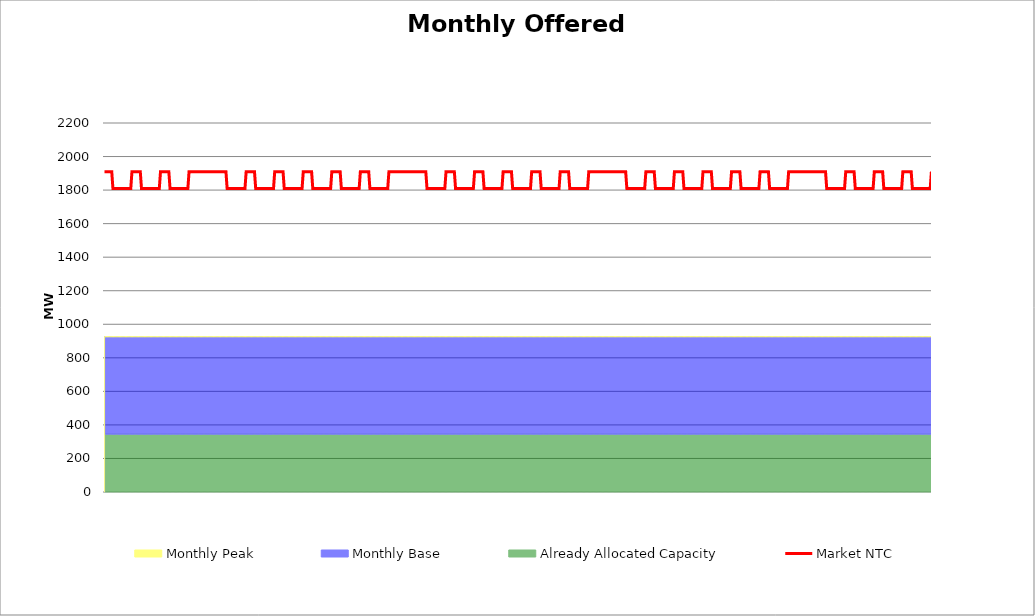
| Category | Market NTC |
|---|---|
| 0 | 1910 |
| 1 | 1910 |
| 2 | 1910 |
| 3 | 1910 |
| 4 | 1910 |
| 5 | 1910 |
| 6 | 1910 |
| 7 | 1810 |
| 8 | 1810 |
| 9 | 1810 |
| 10 | 1810 |
| 11 | 1810 |
| 12 | 1810 |
| 13 | 1810 |
| 14 | 1810 |
| 15 | 1810 |
| 16 | 1810 |
| 17 | 1810 |
| 18 | 1810 |
| 19 | 1810 |
| 20 | 1810 |
| 21 | 1810 |
| 22 | 1810 |
| 23 | 1910 |
| 24 | 1910 |
| 25 | 1910 |
| 26 | 1910 |
| 27 | 1910 |
| 28 | 1910 |
| 29 | 1910 |
| 30 | 1910 |
| 31 | 1810 |
| 32 | 1810 |
| 33 | 1810 |
| 34 | 1810 |
| 35 | 1810 |
| 36 | 1810 |
| 37 | 1810 |
| 38 | 1810 |
| 39 | 1810 |
| 40 | 1810 |
| 41 | 1810 |
| 42 | 1810 |
| 43 | 1810 |
| 44 | 1810 |
| 45 | 1810 |
| 46 | 1810 |
| 47 | 1910 |
| 48 | 1910 |
| 49 | 1910 |
| 50 | 1910 |
| 51 | 1910 |
| 52 | 1910 |
| 53 | 1910 |
| 54 | 1910 |
| 55 | 1810 |
| 56 | 1810 |
| 57 | 1810 |
| 58 | 1810 |
| 59 | 1810 |
| 60 | 1810 |
| 61 | 1810 |
| 62 | 1810 |
| 63 | 1810 |
| 64 | 1810 |
| 65 | 1810 |
| 66 | 1810 |
| 67 | 1810 |
| 68 | 1810 |
| 69 | 1810 |
| 70 | 1810 |
| 71 | 1910 |
| 72 | 1910 |
| 73 | 1910 |
| 74 | 1910 |
| 75 | 1910 |
| 76 | 1910 |
| 77 | 1910 |
| 78 | 1910 |
| 79 | 1910 |
| 80 | 1910 |
| 81 | 1910 |
| 82 | 1910 |
| 83 | 1910 |
| 84 | 1910 |
| 85 | 1910 |
| 86 | 1910 |
| 87 | 1910 |
| 88 | 1910 |
| 89 | 1910 |
| 90 | 1910 |
| 91 | 1910 |
| 92 | 1910 |
| 93 | 1910 |
| 94 | 1910 |
| 95 | 1910 |
| 96 | 1910 |
| 97 | 1910 |
| 98 | 1910 |
| 99 | 1910 |
| 100 | 1910 |
| 101 | 1910 |
| 102 | 1910 |
| 103 | 1810 |
| 104 | 1810 |
| 105 | 1810 |
| 106 | 1810 |
| 107 | 1810 |
| 108 | 1810 |
| 109 | 1810 |
| 110 | 1810 |
| 111 | 1810 |
| 112 | 1810 |
| 113 | 1810 |
| 114 | 1810 |
| 115 | 1810 |
| 116 | 1810 |
| 117 | 1810 |
| 118 | 1810 |
| 119 | 1910 |
| 120 | 1910 |
| 121 | 1910 |
| 122 | 1910 |
| 123 | 1910 |
| 124 | 1910 |
| 125 | 1910 |
| 126 | 1910 |
| 127 | 1810 |
| 128 | 1810 |
| 129 | 1810 |
| 130 | 1810 |
| 131 | 1810 |
| 132 | 1810 |
| 133 | 1810 |
| 134 | 1810 |
| 135 | 1810 |
| 136 | 1810 |
| 137 | 1810 |
| 138 | 1810 |
| 139 | 1810 |
| 140 | 1810 |
| 141 | 1810 |
| 142 | 1810 |
| 143 | 1910 |
| 144 | 1910 |
| 145 | 1910 |
| 146 | 1910 |
| 147 | 1910 |
| 148 | 1910 |
| 149 | 1910 |
| 150 | 1910 |
| 151 | 1810 |
| 152 | 1810 |
| 153 | 1810 |
| 154 | 1810 |
| 155 | 1810 |
| 156 | 1810 |
| 157 | 1810 |
| 158 | 1810 |
| 159 | 1810 |
| 160 | 1810 |
| 161 | 1810 |
| 162 | 1810 |
| 163 | 1810 |
| 164 | 1810 |
| 165 | 1810 |
| 166 | 1810 |
| 167 | 1910 |
| 168 | 1910 |
| 169 | 1910 |
| 170 | 1910 |
| 171 | 1910 |
| 172 | 1910 |
| 173 | 1910 |
| 174 | 1910 |
| 175 | 1810 |
| 176 | 1810 |
| 177 | 1810 |
| 178 | 1810 |
| 179 | 1810 |
| 180 | 1810 |
| 181 | 1810 |
| 182 | 1810 |
| 183 | 1810 |
| 184 | 1810 |
| 185 | 1810 |
| 186 | 1810 |
| 187 | 1810 |
| 188 | 1810 |
| 189 | 1810 |
| 190 | 1810 |
| 191 | 1910 |
| 192 | 1910 |
| 193 | 1910 |
| 194 | 1910 |
| 195 | 1910 |
| 196 | 1910 |
| 197 | 1910 |
| 198 | 1910 |
| 199 | 1810 |
| 200 | 1810 |
| 201 | 1810 |
| 202 | 1810 |
| 203 | 1810 |
| 204 | 1810 |
| 205 | 1810 |
| 206 | 1810 |
| 207 | 1810 |
| 208 | 1810 |
| 209 | 1810 |
| 210 | 1810 |
| 211 | 1810 |
| 212 | 1810 |
| 213 | 1810 |
| 214 | 1810 |
| 215 | 1910 |
| 216 | 1910 |
| 217 | 1910 |
| 218 | 1910 |
| 219 | 1910 |
| 220 | 1910 |
| 221 | 1910 |
| 222 | 1910 |
| 223 | 1810 |
| 224 | 1810 |
| 225 | 1810 |
| 226 | 1810 |
| 227 | 1810 |
| 228 | 1810 |
| 229 | 1810 |
| 230 | 1810 |
| 231 | 1810 |
| 232 | 1810 |
| 233 | 1810 |
| 234 | 1810 |
| 235 | 1810 |
| 236 | 1810 |
| 237 | 1810 |
| 238 | 1810 |
| 239 | 1910 |
| 240 | 1910 |
| 241 | 1910 |
| 242 | 1910 |
| 243 | 1910 |
| 244 | 1910 |
| 245 | 1910 |
| 246 | 1910 |
| 247 | 1910 |
| 248 | 1910 |
| 249 | 1910 |
| 250 | 1910 |
| 251 | 1910 |
| 252 | 1910 |
| 253 | 1910 |
| 254 | 1910 |
| 255 | 1910 |
| 256 | 1910 |
| 257 | 1910 |
| 258 | 1910 |
| 259 | 1910 |
| 260 | 1910 |
| 261 | 1910 |
| 262 | 1910 |
| 263 | 1910 |
| 264 | 1910 |
| 265 | 1910 |
| 266 | 1910 |
| 267 | 1910 |
| 268 | 1910 |
| 269 | 1910 |
| 270 | 1910 |
| 271 | 1810 |
| 272 | 1810 |
| 273 | 1810 |
| 274 | 1810 |
| 275 | 1810 |
| 276 | 1810 |
| 277 | 1810 |
| 278 | 1810 |
| 279 | 1810 |
| 280 | 1810 |
| 281 | 1810 |
| 282 | 1810 |
| 283 | 1810 |
| 284 | 1810 |
| 285 | 1810 |
| 286 | 1810 |
| 287 | 1910 |
| 288 | 1910 |
| 289 | 1910 |
| 290 | 1910 |
| 291 | 1910 |
| 292 | 1910 |
| 293 | 1910 |
| 294 | 1910 |
| 295 | 1810 |
| 296 | 1810 |
| 297 | 1810 |
| 298 | 1810 |
| 299 | 1810 |
| 300 | 1810 |
| 301 | 1810 |
| 302 | 1810 |
| 303 | 1810 |
| 304 | 1810 |
| 305 | 1810 |
| 306 | 1810 |
| 307 | 1810 |
| 308 | 1810 |
| 309 | 1810 |
| 310 | 1810 |
| 311 | 1910 |
| 312 | 1910 |
| 313 | 1910 |
| 314 | 1910 |
| 315 | 1910 |
| 316 | 1910 |
| 317 | 1910 |
| 318 | 1910 |
| 319 | 1810 |
| 320 | 1810 |
| 321 | 1810 |
| 322 | 1810 |
| 323 | 1810 |
| 324 | 1810 |
| 325 | 1810 |
| 326 | 1810 |
| 327 | 1810 |
| 328 | 1810 |
| 329 | 1810 |
| 330 | 1810 |
| 331 | 1810 |
| 332 | 1810 |
| 333 | 1810 |
| 334 | 1810 |
| 335 | 1910 |
| 336 | 1910 |
| 337 | 1910 |
| 338 | 1910 |
| 339 | 1910 |
| 340 | 1910 |
| 341 | 1910 |
| 342 | 1910 |
| 343 | 1810 |
| 344 | 1810 |
| 345 | 1810 |
| 346 | 1810 |
| 347 | 1810 |
| 348 | 1810 |
| 349 | 1810 |
| 350 | 1810 |
| 351 | 1810 |
| 352 | 1810 |
| 353 | 1810 |
| 354 | 1810 |
| 355 | 1810 |
| 356 | 1810 |
| 357 | 1810 |
| 358 | 1810 |
| 359 | 1910 |
| 360 | 1910 |
| 361 | 1910 |
| 362 | 1910 |
| 363 | 1910 |
| 364 | 1910 |
| 365 | 1910 |
| 366 | 1910 |
| 367 | 1810 |
| 368 | 1810 |
| 369 | 1810 |
| 370 | 1810 |
| 371 | 1810 |
| 372 | 1810 |
| 373 | 1810 |
| 374 | 1810 |
| 375 | 1810 |
| 376 | 1810 |
| 377 | 1810 |
| 378 | 1810 |
| 379 | 1810 |
| 380 | 1810 |
| 381 | 1810 |
| 382 | 1810 |
| 383 | 1910 |
| 384 | 1910 |
| 385 | 1910 |
| 386 | 1910 |
| 387 | 1910 |
| 388 | 1910 |
| 389 | 1910 |
| 390 | 1910 |
| 391 | 1810 |
| 392 | 1810 |
| 393 | 1810 |
| 394 | 1810 |
| 395 | 1810 |
| 396 | 1810 |
| 397 | 1810 |
| 398 | 1810 |
| 399 | 1810 |
| 400 | 1810 |
| 401 | 1810 |
| 402 | 1810 |
| 403 | 1810 |
| 404 | 1810 |
| 405 | 1810 |
| 406 | 1810 |
| 407 | 1910 |
| 408 | 1910 |
| 409 | 1910 |
| 410 | 1910 |
| 411 | 1910 |
| 412 | 1910 |
| 413 | 1910 |
| 414 | 1910 |
| 415 | 1910 |
| 416 | 1910 |
| 417 | 1910 |
| 418 | 1910 |
| 419 | 1910 |
| 420 | 1910 |
| 421 | 1910 |
| 422 | 1910 |
| 423 | 1910 |
| 424 | 1910 |
| 425 | 1910 |
| 426 | 1910 |
| 427 | 1910 |
| 428 | 1910 |
| 429 | 1910 |
| 430 | 1910 |
| 431 | 1910 |
| 432 | 1910 |
| 433 | 1910 |
| 434 | 1910 |
| 435 | 1910 |
| 436 | 1910 |
| 437 | 1910 |
| 438 | 1910 |
| 439 | 1810 |
| 440 | 1810 |
| 441 | 1810 |
| 442 | 1810 |
| 443 | 1810 |
| 444 | 1810 |
| 445 | 1810 |
| 446 | 1810 |
| 447 | 1810 |
| 448 | 1810 |
| 449 | 1810 |
| 450 | 1810 |
| 451 | 1810 |
| 452 | 1810 |
| 453 | 1810 |
| 454 | 1810 |
| 455 | 1910 |
| 456 | 1910 |
| 457 | 1910 |
| 458 | 1910 |
| 459 | 1910 |
| 460 | 1910 |
| 461 | 1910 |
| 462 | 1910 |
| 463 | 1810 |
| 464 | 1810 |
| 465 | 1810 |
| 466 | 1810 |
| 467 | 1810 |
| 468 | 1810 |
| 469 | 1810 |
| 470 | 1810 |
| 471 | 1810 |
| 472 | 1810 |
| 473 | 1810 |
| 474 | 1810 |
| 475 | 1810 |
| 476 | 1810 |
| 477 | 1810 |
| 478 | 1810 |
| 479 | 1910 |
| 480 | 1910 |
| 481 | 1910 |
| 482 | 1910 |
| 483 | 1910 |
| 484 | 1910 |
| 485 | 1910 |
| 486 | 1910 |
| 487 | 1810 |
| 488 | 1810 |
| 489 | 1810 |
| 490 | 1810 |
| 491 | 1810 |
| 492 | 1810 |
| 493 | 1810 |
| 494 | 1810 |
| 495 | 1810 |
| 496 | 1810 |
| 497 | 1810 |
| 498 | 1810 |
| 499 | 1810 |
| 500 | 1810 |
| 501 | 1810 |
| 502 | 1810 |
| 503 | 1910 |
| 504 | 1910 |
| 505 | 1910 |
| 506 | 1910 |
| 507 | 1910 |
| 508 | 1910 |
| 509 | 1910 |
| 510 | 1910 |
| 511 | 1810 |
| 512 | 1810 |
| 513 | 1810 |
| 514 | 1810 |
| 515 | 1810 |
| 516 | 1810 |
| 517 | 1810 |
| 518 | 1810 |
| 519 | 1810 |
| 520 | 1810 |
| 521 | 1810 |
| 522 | 1810 |
| 523 | 1810 |
| 524 | 1810 |
| 525 | 1810 |
| 526 | 1810 |
| 527 | 1910 |
| 528 | 1910 |
| 529 | 1910 |
| 530 | 1910 |
| 531 | 1910 |
| 532 | 1910 |
| 533 | 1910 |
| 534 | 1910 |
| 535 | 1810 |
| 536 | 1810 |
| 537 | 1810 |
| 538 | 1810 |
| 539 | 1810 |
| 540 | 1810 |
| 541 | 1810 |
| 542 | 1810 |
| 543 | 1810 |
| 544 | 1810 |
| 545 | 1810 |
| 546 | 1810 |
| 547 | 1810 |
| 548 | 1810 |
| 549 | 1810 |
| 550 | 1810 |
| 551 | 1910 |
| 552 | 1910 |
| 553 | 1910 |
| 554 | 1910 |
| 555 | 1910 |
| 556 | 1910 |
| 557 | 1910 |
| 558 | 1910 |
| 559 | 1810 |
| 560 | 1810 |
| 561 | 1810 |
| 562 | 1810 |
| 563 | 1810 |
| 564 | 1810 |
| 565 | 1810 |
| 566 | 1810 |
| 567 | 1810 |
| 568 | 1810 |
| 569 | 1810 |
| 570 | 1810 |
| 571 | 1810 |
| 572 | 1810 |
| 573 | 1810 |
| 574 | 1810 |
| 575 | 1910 |
| 576 | 1910 |
| 577 | 1910 |
| 578 | 1910 |
| 579 | 1910 |
| 580 | 1910 |
| 581 | 1910 |
| 582 | 1910 |
| 583 | 1910 |
| 584 | 1910 |
| 585 | 1910 |
| 586 | 1910 |
| 587 | 1910 |
| 588 | 1910 |
| 589 | 1910 |
| 590 | 1910 |
| 591 | 1910 |
| 592 | 1910 |
| 593 | 1910 |
| 594 | 1910 |
| 595 | 1910 |
| 596 | 1910 |
| 597 | 1910 |
| 598 | 1910 |
| 599 | 1910 |
| 600 | 1910 |
| 601 | 1910 |
| 602 | 1910 |
| 603 | 1910 |
| 604 | 1910 |
| 605 | 1910 |
| 606 | 1910 |
| 607 | 1810 |
| 608 | 1810 |
| 609 | 1810 |
| 610 | 1810 |
| 611 | 1810 |
| 612 | 1810 |
| 613 | 1810 |
| 614 | 1810 |
| 615 | 1810 |
| 616 | 1810 |
| 617 | 1810 |
| 618 | 1810 |
| 619 | 1810 |
| 620 | 1810 |
| 621 | 1810 |
| 622 | 1810 |
| 623 | 1910 |
| 624 | 1910 |
| 625 | 1910 |
| 626 | 1910 |
| 627 | 1910 |
| 628 | 1910 |
| 629 | 1910 |
| 630 | 1910 |
| 631 | 1810 |
| 632 | 1810 |
| 633 | 1810 |
| 634 | 1810 |
| 635 | 1810 |
| 636 | 1810 |
| 637 | 1810 |
| 638 | 1810 |
| 639 | 1810 |
| 640 | 1810 |
| 641 | 1810 |
| 642 | 1810 |
| 643 | 1810 |
| 644 | 1810 |
| 645 | 1810 |
| 646 | 1810 |
| 647 | 1910 |
| 648 | 1910 |
| 649 | 1910 |
| 650 | 1910 |
| 651 | 1910 |
| 652 | 1910 |
| 653 | 1910 |
| 654 | 1910 |
| 655 | 1810 |
| 656 | 1810 |
| 657 | 1810 |
| 658 | 1810 |
| 659 | 1810 |
| 660 | 1810 |
| 661 | 1810 |
| 662 | 1810 |
| 663 | 1810 |
| 664 | 1810 |
| 665 | 1810 |
| 666 | 1810 |
| 667 | 1810 |
| 668 | 1810 |
| 669 | 1810 |
| 670 | 1810 |
| 671 | 1910 |
| 672 | 1910 |
| 673 | 1910 |
| 674 | 1910 |
| 675 | 1910 |
| 676 | 1910 |
| 677 | 1910 |
| 678 | 1910 |
| 679 | 1810 |
| 680 | 1810 |
| 681 | 1810 |
| 682 | 1810 |
| 683 | 1810 |
| 684 | 1810 |
| 685 | 1810 |
| 686 | 1810 |
| 687 | 1810 |
| 688 | 1810 |
| 689 | 1810 |
| 690 | 1810 |
| 691 | 1810 |
| 692 | 1810 |
| 693 | 1810 |
| 694 | 1810 |
| 695 | 1910 |